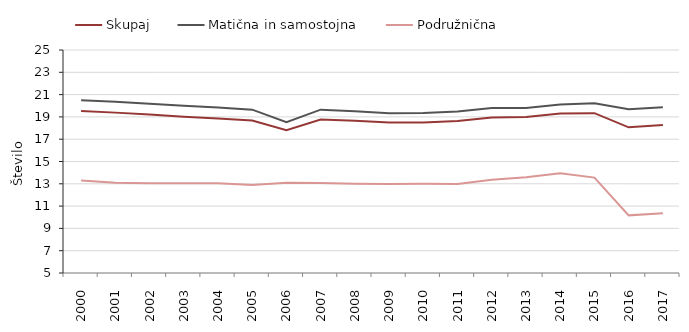
| Category | Skupaj | Matična in samostojna | Podružnična |
|---|---|---|---|
| 2000 | 19.534 | 20.489 | 13.303 |
| 2001 | 19.384 | 20.358 | 13.101 |
| 2002 | 19.219 | 20.184 | 13.051 |
| 2003 | 19.004 | 19.993 | 13.06 |
| 2004 | 18.85 | 19.833 | 13.047 |
| 2005 | 18.684 | 19.651 | 12.884 |
| 2006 | 17.814 | 18.535 | 13.086 |
| 2007 | 18.758 | 19.651 | 13.082 |
| 2008 | 18.662 | 19.517 | 13 |
| 2009 | 18.503 | 19.323 | 12.982 |
| 2010 | 18.509 | 19.349 | 13.004 |
| 2011 | 18.635 | 19.493 | 12.972 |
| 2012 | 18.943 | 19.79 | 13.373 |
| 2013 | 18.994 | 19.808 | 13.581 |
| 2014 | 19.295 | 20.105 | 13.938 |
| 2015 | 19.336 | 20.228 | 13.557 |
| 2016 | 18.064 | 19.691 | 10.17 |
| 2017 | 18.28 | 19.87 | 10.36 |